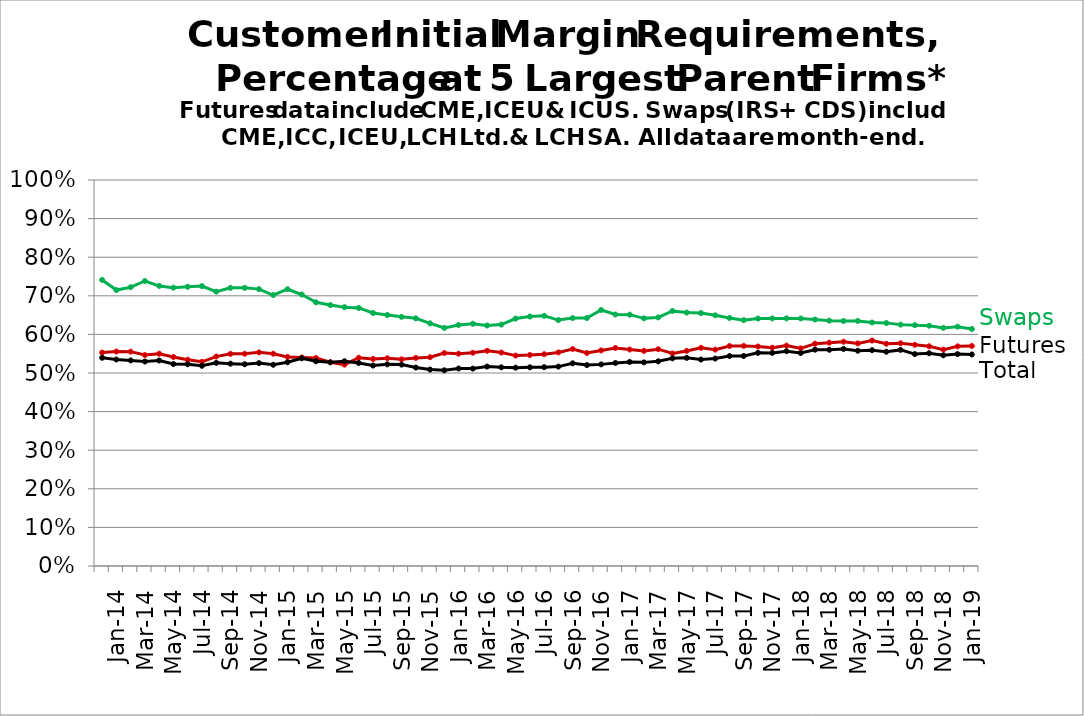
| Category | Futures | Swaps | Total | Series 8 | Series 9 |
|---|---|---|---|---|---|
|   |  |  |  |  |  |
| Jan-14 |  |  |  |  |  |
|   |  |  |  |  |  |
| Mar-14 |  |  |  |  |  |
|   |  |  |  |  |  |
| May-14 |  |  |  |  |  |
|   |  |  |  |  |  |
| Jul-14 |  |  |  |  |  |
|   |  |  |  |  |  |
| Sep-14 |  |  |  |  |  |
|   |  |  |  |  |  |
| Nov-14 |  |  |  |  |  |
|   |  |  |  |  |  |
| Jan-15 |  |  |  |  |  |
|   |  |  |  |  |  |
| Mar-15 |  |  |  |  |  |
|   |  |  |  |  |  |
| May-15 |  |  |  |  |  |
|   |  |  |  |  |  |
| Jul-15 |  |  |  |  |  |
|   |  |  |  |  |  |
| Sep-15 |  |  |  |  |  |
|   |  |  |  |  |  |
| Nov-15 |  |  |  |  |  |
|   |  |  |  |  |  |
| Jan-16 |  |  |  |  |  |
|   |  |  |  |  |  |
| Mar-16 |  |  |  |  |  |
|   |  |  |  |  |  |
| May-16 |  |  |  |  |  |
|   |  |  |  |  |  |
| Jul-16 |  |  |  |  |  |
|   |  |  |  |  |  |
| Sep-16 |  |  |  |  |  |
|   |  |  |  |  |  |
| Nov-16 |  |  |  |  |  |
|   |  |  |  |  |  |
| Jan-17 |  |  |  |  |  |
|   |  |  |  |  |  |
| Mar-17 |  |  |  |  |  |
|   |  |  |  |  |  |
| May-17 |  |  |  |  |  |
|   |  |  |  |  |  |
| Jul-17 |  |  |  |  |  |
|   |  |  |  |  |  |
| Sep-17 |  |  |  |  |  |
|   |  |  |  |  |  |
| Nov-17 |  |  |  |  |  |
|   |  |  |  |  |  |
| Jan-18 |  |  |  |  |  |
|   |  |  |  |  |  |
| Mar-18 |  |  |  |  |  |
|   |  |  |  |  |  |
| May-18 |  |  |  |  |  |
|   |  |  |  |  |  |
| Jul-18 |  |  |  |  |  |
|   |  |  |  |  |  |
| Sep-18 |  |  |  |  |  |
|   |  |  |  |  |  |
| Nov-18 |  |  |  |  |  |
|   |  |  |  |  |  |
| Jan-19 |  |  |  |  |  |